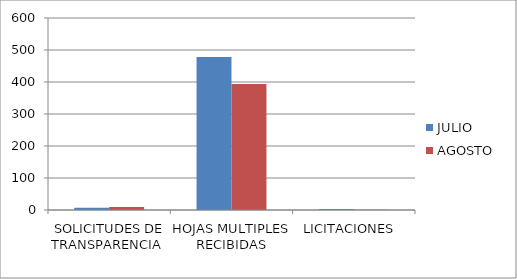
| Category | JULIO | AGOSTO  |
|---|---|---|
| SOLICITUDES DE TRANSPARENCIA  | 7 | 9 |
| HOJAS MULTIPLES RECIBIDAS | 478 | 394 |
| LICITACIONES  | 3 | 1 |